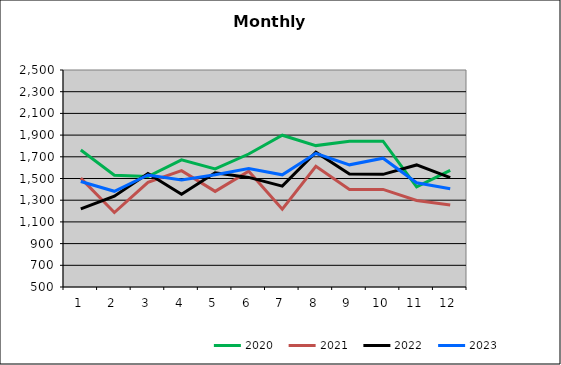
| Category | 2020 | 2021 | 2022 | 2023 |
|---|---|---|---|---|
| 0 | 1762.064 | 1503.68 | 1219.945 | 1471.942 |
| 1 | 1530.829 | 1186.293 | 1336.681 | 1382.042 |
| 2 | 1518.163 | 1464.516 | 1545.46 | 1532.52 |
| 3 | 1671.58 | 1572.076 | 1354.89 | 1485.632 |
| 4 | 1589.128 | 1381.3 | 1552.185 | 1533.974 |
| 5 | 1725.706 | 1567.527 | 1510.185 | 1590.799 |
| 6 | 1898.774 | 1216.971 | 1429.988 | 1533.818 |
| 7 | 1803.166 | 1613.137 | 1742.939 | 1731.961 |
| 8 | 1843.578 | 1398.947 | 1540.494 | 1625.98 |
| 9 | 1843.468 | 1399.401 | 1538.281 | 1687.348 |
| 10 | 1422.612 | 1297.013 | 1625.039 | 1460.107 |
| 11 | 1574.354 | 1256.018 | 1508.631 | 1405.735 |